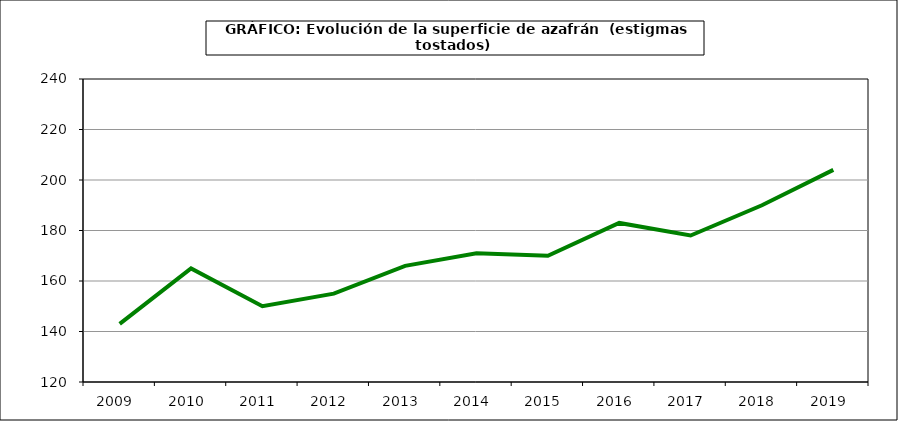
| Category | Superficie |
|---|---|
| 2009.0 | 143 |
| 2010.0 | 165 |
| 2011.0 | 150 |
| 2012.0 | 155 |
| 2013.0 | 166 |
| 2014.0 | 171 |
| 2015.0 | 170 |
| 2016.0 | 183 |
| 2017.0 | 178 |
| 2018.0 | 190 |
| 2019.0 | 204 |